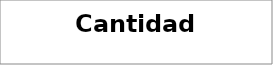
| Category | Series 0 |
|---|---|
| Baja en la moral de la tropa | 1 |
| Deterioro de la imagen pública. | 12 |
| Fraude y malversación de fondos | 3 |
| Fuga de información | 49 |
| Incumplimiento de tipo legal o contractual | 3 |
| Indisponibilidad colateral de otros servicios | 84 |
| Interrupción del servicio o del negocio | 66 |
| Pérdida de productividad de los empleados | 87 |
| Pérdida en la efectividad | 81 |
| Perjuicio a la relaciones de la Entidad con otros organismos | 5 |
| Retraso en la toma de decisiones | 29 |
| Sanciones | 4 |
| Toma de decisiones erradas | 54 |